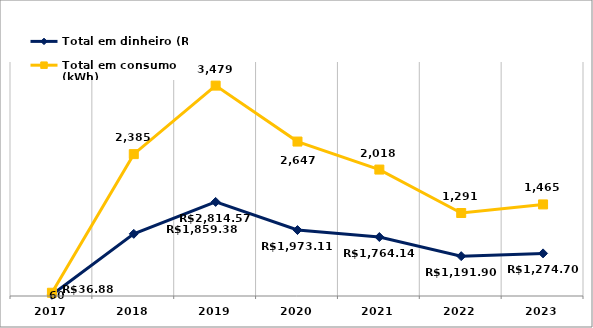
| Category | Total em dinheiro (R$) | Total em consumo (kWh) |
|---|---|---|
| 2017.0 | 36.88 | 60 |
| 2018.0 | 1859.38 | 2385 |
| 2019.0 | 2814.57 | 3479 |
| 2020.0 | 1973.11 | 2647 |
| 2021.0 | 1764.14 | 2018 |
| 2022.0 | 1191.9 | 1291 |
| 2023.0 | 1274.7 | 1465 |